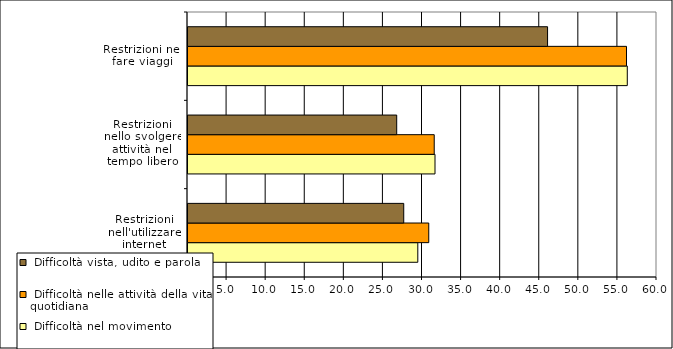
| Category |  Difficoltà nel movimento |  Difficoltà nelle attività della vita quotidiana  |  Difficoltà vista, udito e parola |
|---|---|---|---|
| Restrizioni nell'utilizzare internet | 29.4 | 30.8 | 27.6 |
| Restrizioni nello svolgere attività nel tempo libero | 31.6 | 31.5 | 26.7 |
| Restrizioni nel fare viaggi | 56.2 | 56.1 | 46 |